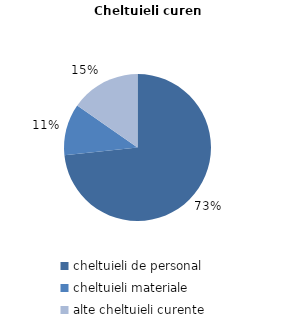
| Category | Series 0 |
|---|---|
| cheltuieli de personal | 73.3 |
| cheltuieli materiale | 11.4 |
| alte cheltuieli curente | 15.3 |